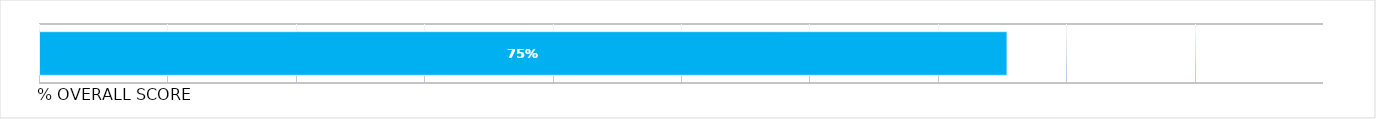
| Category | 75% |
|---|---|
| 0.7539129997990759 | 0.754 |